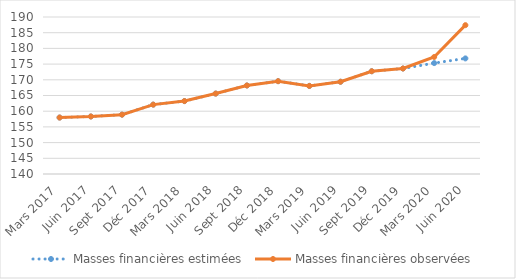
| Category | Masses financières estimées | Masses financières observées  |
|---|---|---|
| Mars 2017 | 157.98 | 157.98 |
| Juin 2017 | 158.32 | 158.32 |
| Sept 2017 | 158.902 | 158.902 |
| Déc 2017 | 162.097 | 162.097 |
| Mars 2018 | 163.226 | 163.226 |
| Juin 2018 | 165.611 | 165.611 |
| Sept 2018 | 168.19 | 168.19 |
| Déc 2018 | 169.563 | 169.563 |
| Mars 2019 | 168.059 | 168.059 |
| Juin 2019 | 169.384 | 169.384 |
| Sept 2019 | 172.721 | 172.721 |
| Déc 2019 | 173.595 | 173.595 |
| Mars 2020 | 175.321 | 177.268 |
| Juin 2020 | 176.811 | 187.398 |